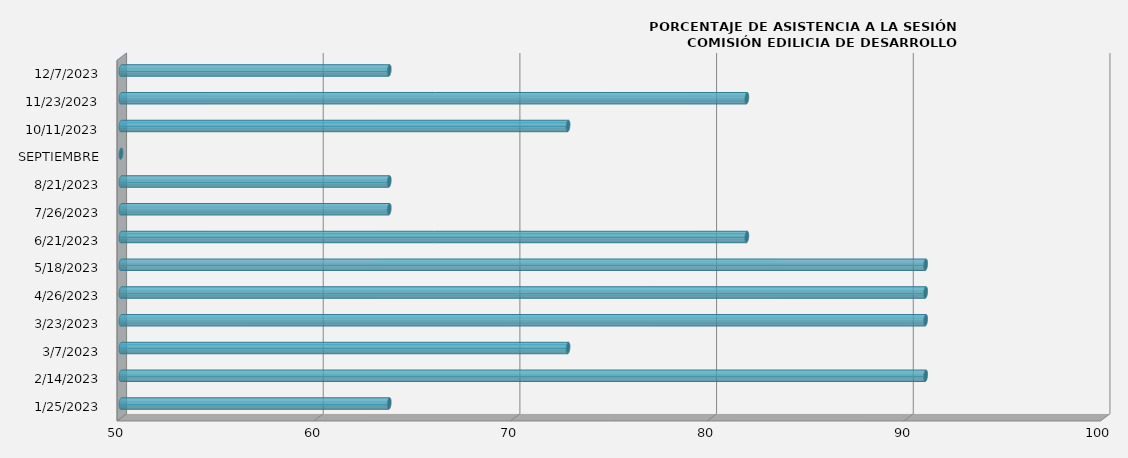
| Category | Series 0 |
|---|---|
| 25/01/2023 | 63.636 |
| 14/02/2023 | 90.909 |
| 07/03/2023 | 72.727 |
| 23/03/2023 | 90.909 |
| 26/04/2023 | 90.909 |
| 18/05/2023 | 90.909 |
| 21/06/2023 | 81.818 |
| 26/07/2023 | 63.636 |
| 21/08/2023 | 63.636 |
| SEPTIEMBRE | 0 |
| 11/10/2023 | 72.727 |
| 23/11/2023 | 81.818 |
| 07/12/2023 | 63.636 |